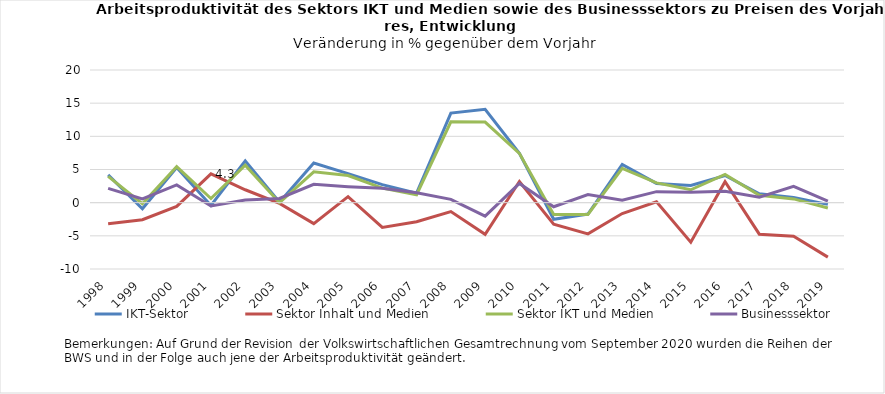
| Category | IKT-Sektor | Sektor Inhalt und Medien | Sektor IKT und Medien | Businesssektor |
|---|---|---|---|---|
| 1998.0 | 4.199 | -3.191 | 3.964 | 2.148 |
| 1999.0 | -0.922 | -2.578 | -0.153 | 0.555 |
| 2000.0 | 5.306 | -0.564 | 5.423 | 2.674 |
| 2001.0 | -0.413 | 4.335 | 0.628 | -0.499 |
| 2002.0 | 6.289 | 1.946 | 5.638 | 0.416 |
| 2003.0 | 0.07 | -0.114 | 0.003 | 0.636 |
| 2004.0 | 5.978 | -3.159 | 4.645 | 2.767 |
| 2005.0 | 4.388 | 0.906 | 4.085 | 2.417 |
| 2006.0 | 2.722 | -3.722 | 2.188 | 2.169 |
| 2007.0 | 1.428 | -2.875 | 1.195 | 1.486 |
| 2008.0 | 13.507 | -1.349 | 12.18 | 0.496 |
| 2009.0 | 14.067 | -4.77 | 12.149 | -2.041 |
| 2010.0 | 7.431 | 3.194 | 7.432 | 2.884 |
| 2011.0 | -2.501 | -3.249 | -1.788 | -0.609 |
| 2012.0 | -1.721 | -4.7 | -1.775 | 1.212 |
| 2013.0 | 5.747 | -1.641 | 5.173 | 0.386 |
| 2014.0 | 2.902 | 0.122 | 2.982 | 1.659 |
| 2015.0 | 2.595 | -5.948 | 1.948 | 1.577 |
| 2016.0 | 4.096 | 3.168 | 4.264 | 1.728 |
| 2017.0 | 1.349 | -4.75 | 1.109 | 0.815 |
| 2018.0 | 0.763 | -5.057 | 0.569 | 2.458 |
| 2019.0 | -0.255 | -8.21 | -0.8 | 0.245 |